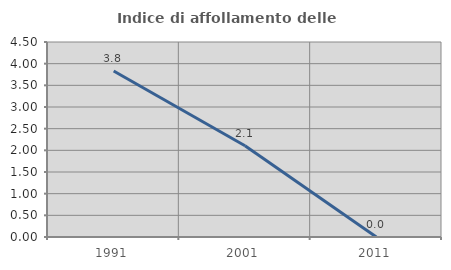
| Category | Indice di affollamento delle abitazioni  |
|---|---|
| 1991.0 | 3.83 |
| 2001.0 | 2.105 |
| 2011.0 | 0 |